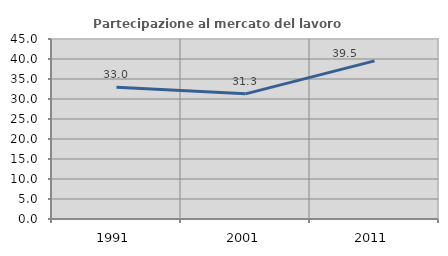
| Category | Partecipazione al mercato del lavoro  femminile |
|---|---|
| 1991.0 | 32.965 |
| 2001.0 | 31.29 |
| 2011.0 | 39.52 |